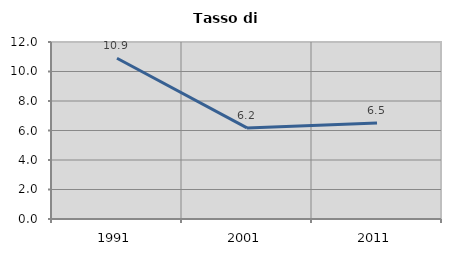
| Category | Tasso di disoccupazione   |
|---|---|
| 1991.0 | 10.898 |
| 2001.0 | 6.175 |
| 2011.0 | 6.514 |